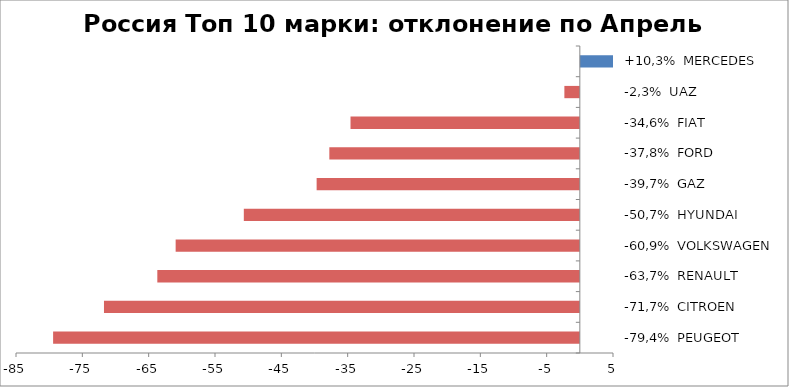
| Category | Россия Топ 10 марки: отклонение по Апрель 2015-2014 |
|---|---|
| -79,4%  PEUGEOT | -79.405 |
| -71,7%  CITROEN | -71.737 |
| -63,7%  RENAULT | -63.695 |
| -60,9%  VOLKSWAGEN | -60.932 |
| -50,7%  HYUNDAI | -50.656 |
| -39,7%  GAZ | -39.679 |
| -37,8%  FORD | -37.764 |
| -34,6%  FIAT | -34.57 |
| -2,3%  UAZ | -2.331 |
| +10,3%  MERCEDES | 10.336 |